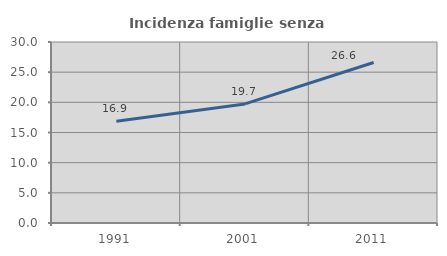
| Category | Incidenza famiglie senza nuclei |
|---|---|
| 1991.0 | 16.878 |
| 2001.0 | 19.737 |
| 2011.0 | 26.601 |